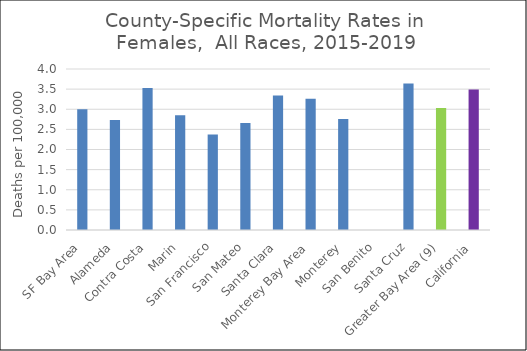
| Category | Female |
|---|---|
| SF Bay Area | 3 |
|   Alameda | 2.73 |
|   Contra Costa | 3.53 |
|   Marin | 2.85 |
|   San Francisco | 2.37 |
|   San Mateo | 2.66 |
|   Santa Clara | 3.34 |
| Monterey Bay Area | 3.26 |
|   Monterey | 2.76 |
|   San Benito | 0 |
|   Santa Cruz | 3.64 |
| Greater Bay Area (9) | 3.03 |
| California | 3.49 |